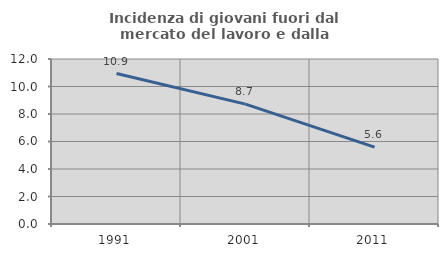
| Category | Incidenza di giovani fuori dal mercato del lavoro e dalla formazione  |
|---|---|
| 1991.0 | 10.945 |
| 2001.0 | 8.721 |
| 2011.0 | 5.594 |